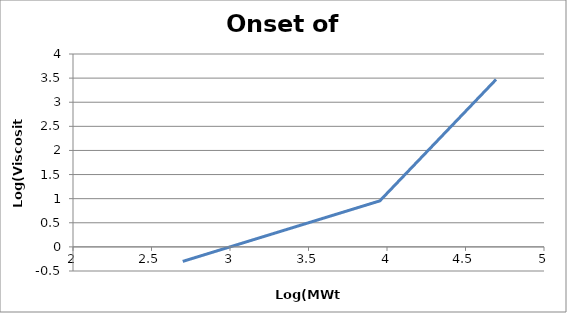
| Category | Series 0 |
|---|---|
| 2.6989700043360187 | -0.301 |
| 3.0 | 0 |
| 3.1760912590556813 | 0.176 |
| 3.3010299956639813 | 0.301 |
| 3.3979400086720375 | 0.398 |
| 3.4771212547196626 | 0.477 |
| 3.5440680443502757 | 0.544 |
| 3.6020599913279625 | 0.602 |
| 3.6532125137753435 | 0.653 |
| 3.6989700043360187 | 0.699 |
| 3.7403626894942437 | 0.74 |
| 3.7781512503836434 | 0.778 |
| 3.8129133566428557 | 0.813 |
| 3.845098040014257 | 0.845 |
| 3.8750612633917 | 0.875 |
| 3.9030899869919438 | 0.903 |
| 3.929418925714293 | 0.929 |
| 3.9542425094393248 | 0.954 |
| 3.9777236052888476 | 1.034 |
| 4.0 | 1.11 |
| 4.021189299069938 | 1.182 |
| 4.041392685158225 | 1.251 |
| 4.060697840353612 | 1.316 |
| 4.079181246047625 | 1.379 |
| 4.096910013008056 | 1.439 |
| 4.113943352306837 | 1.497 |
| 4.1303337684950066 | 1.553 |
| 4.146128035678238 | 1.607 |
| 4.161368002234975 | 1.658 |
| 4.176091259055681 | 1.709 |
| 4.190331698170292 | 1.757 |
| 4.204119982655925 | 1.804 |
| 4.217483944213907 | 1.849 |
| 4.230448921378274 | 1.893 |
| 4.243038048686294 | 1.936 |
| 4.2552725051033065 | 1.978 |
| 4.267171728403014 | 2.018 |
| 4.278753600952829 | 2.058 |
| 4.290034611362518 | 2.096 |
| 4.301029995663981 | 2.133 |
| 4.311753861055754 | 2.17 |
| 4.3222192947339195 | 2.205 |
| 4.332438459915605 | 2.24 |
| 4.342422680822207 | 2.274 |
| 4.352182518111363 | 2.307 |
| 4.361727836017593 | 2.34 |
| 4.371067862271736 | 2.371 |
| 4.380211241711606 | 2.403 |
| 4.389166084364533 | 2.433 |
| 4.3979400086720375 | 2.463 |
| 4.4065401804339555 | 2.492 |
| 4.414973347970818 | 2.521 |
| 4.423245873936808 | 2.549 |
| 4.431363764158987 | 2.576 |
| 4.439332693830263 | 2.604 |
| 4.447158031342219 | 2.63 |
| 4.45484486000851 | 2.656 |
| 4.4623979978989565 | 2.682 |
| 4.469822015978163 | 2.707 |
| 4.477121254719663 | 2.732 |
| 4.484299839346786 | 2.756 |
| 4.491361693834273 | 2.78 |
| 4.498310553789601 | 2.804 |
| 4.505149978319906 | 2.827 |
| 4.511883360978874 | 2.85 |
| 4.518513939877887 | 2.873 |
| 4.525044807036846 | 2.895 |
| 4.531478917042255 | 2.917 |
| 4.537819095073274 | 2.938 |
| 4.544068044350276 | 2.96 |
| 4.550228353055094 | 2.981 |
| 4.556302500767287 | 3.001 |
| 4.562292864456475 | 3.022 |
| 4.568201724066995 | 3.042 |
| 4.574031267727719 | 3.062 |
| 4.57978359661681 | 3.081 |
| 4.585460729508501 | 3.1 |
| 4.5910646070264995 | 3.119 |
| 4.596597095626461 | 3.138 |
| 4.6020599913279625 | 3.157 |
| 4.607455023214668 | 3.175 |
| 4.6127838567197355 | 3.193 |
| 4.6180480967120925 | 3.211 |
| 4.623249290397901 | 3.229 |
| 4.628388930050312 | 3.246 |
| 4.633468455579586 | 3.264 |
| 4.638489256954637 | 3.281 |
| 4.643452676486188 | 3.298 |
| 4.648360010980932 | 3.314 |
| 4.653212513775344 | 3.331 |
| 4.658011396657113 | 3.347 |
| 4.662757831681574 | 3.363 |
| 4.6674529528899535 | 3.379 |
| 4.672097857935717 | 3.395 |
| 4.676693609624866 | 3.411 |
| 4.681241237375588 | 3.426 |
| 4.685741738602264 | 3.441 |
| 4.690196080028514 | 3.456 |
| 4.694605198933568 | 3.471 |
| 4.698970004336019 | 3.486 |